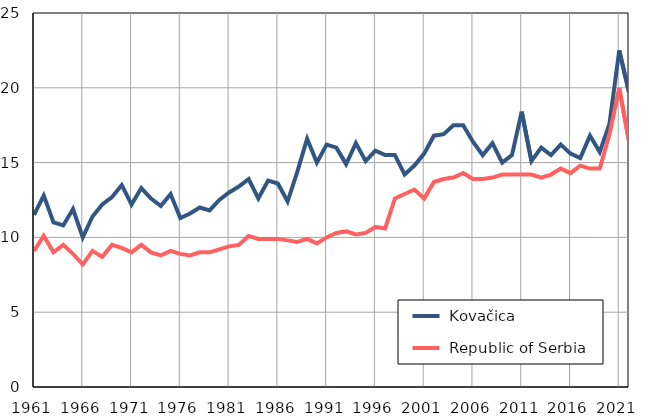
| Category |  Kovačica |  Republic of Serbia |
|---|---|---|
| 1961.0 | 11.5 | 9.1 |
| 1962.0 | 12.8 | 10.1 |
| 1963.0 | 11 | 9 |
| 1964.0 | 10.8 | 9.5 |
| 1965.0 | 11.9 | 8.9 |
| 1966.0 | 10 | 8.2 |
| 1967.0 | 11.4 | 9.1 |
| 1968.0 | 12.2 | 8.7 |
| 1969.0 | 12.7 | 9.5 |
| 1970.0 | 13.5 | 9.3 |
| 1971.0 | 12.2 | 9 |
| 1972.0 | 13.3 | 9.5 |
| 1973.0 | 12.6 | 9 |
| 1974.0 | 12.1 | 8.8 |
| 1975.0 | 12.9 | 9.1 |
| 1976.0 | 11.3 | 8.9 |
| 1977.0 | 11.6 | 8.8 |
| 1978.0 | 12 | 9 |
| 1979.0 | 11.8 | 9 |
| 1980.0 | 12.5 | 9.2 |
| 1981.0 | 13 | 9.4 |
| 1982.0 | 13.4 | 9.5 |
| 1983.0 | 13.9 | 10.1 |
| 1984.0 | 12.6 | 9.9 |
| 1985.0 | 13.8 | 9.9 |
| 1986.0 | 13.6 | 9.9 |
| 1987.0 | 12.4 | 9.8 |
| 1988.0 | 14.4 | 9.7 |
| 1989.0 | 16.6 | 9.9 |
| 1990.0 | 15 | 9.6 |
| 1991.0 | 16.2 | 10 |
| 1992.0 | 16 | 10.3 |
| 1993.0 | 14.9 | 10.4 |
| 1994.0 | 16.3 | 10.2 |
| 1995.0 | 15.1 | 10.3 |
| 1996.0 | 15.8 | 10.7 |
| 1997.0 | 15.5 | 10.6 |
| 1998.0 | 15.5 | 12.6 |
| 1999.0 | 14.2 | 12.9 |
| 2000.0 | 14.8 | 13.2 |
| 2001.0 | 15.6 | 12.6 |
| 2002.0 | 16.8 | 13.7 |
| 2003.0 | 16.9 | 13.9 |
| 2004.0 | 17.5 | 14 |
| 2005.0 | 17.5 | 14.3 |
| 2006.0 | 16.4 | 13.9 |
| 2007.0 | 15.5 | 13.9 |
| 2008.0 | 16.3 | 14 |
| 2009.0 | 15 | 14.2 |
| 2010.0 | 15.5 | 14.2 |
| 2011.0 | 18.4 | 14.2 |
| 2012.0 | 15.1 | 14.2 |
| 2013.0 | 16 | 14 |
| 2014.0 | 15.5 | 14.2 |
| 2015.0 | 16.2 | 14.6 |
| 2016.0 | 15.6 | 14.3 |
| 2017.0 | 15.3 | 14.8 |
| 2018.0 | 16.8 | 14.6 |
| 2019.0 | 15.7 | 14.6 |
| 2020.0 | 17.6 | 16.9 |
| 2021.0 | 22.5 | 20 |
| 2022.0 | 19.7 | 16.4 |